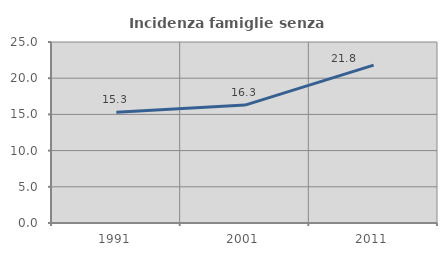
| Category | Incidenza famiglie senza nuclei |
|---|---|
| 1991.0 | 15.284 |
| 2001.0 | 16.284 |
| 2011.0 | 21.798 |